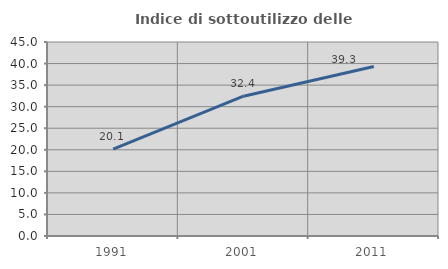
| Category | Indice di sottoutilizzo delle abitazioni  |
|---|---|
| 1991.0 | 20.133 |
| 2001.0 | 32.426 |
| 2011.0 | 39.337 |